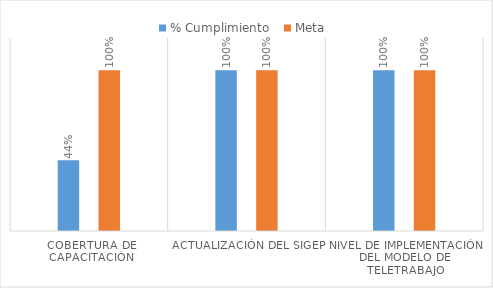
| Category | % Cumplimiento  | Meta  |
|---|---|---|
| Cobertura de capacitación | 0.44 | 1 |
| Actualización del SIGEP | 1 | 1 |
| Nivel de implementación del modelo de teletrabajo | 1 | 1 |